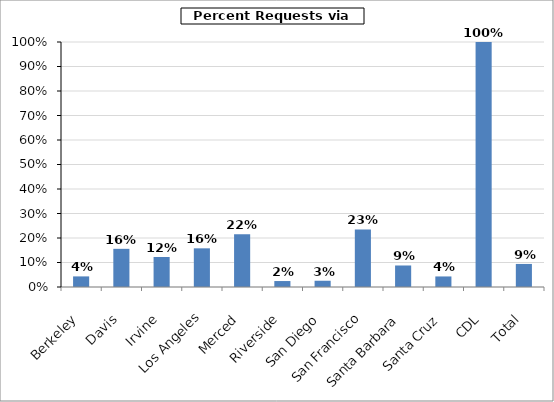
| Category | Series 0 |
|---|---|
| Berkeley | 0.043 |
| Davis | 0.156 |
| Irvine | 0.123 |
| Los Angeles | 0.158 |
| Merced | 0.215 |
| Riverside | 0.024 |
| San Diego | 0.026 |
| San Francisco | 0.235 |
| Santa Barbara | 0.088 |
| Santa Cruz | 0.043 |
| CDL | 1 |
| Total | 0.094 |